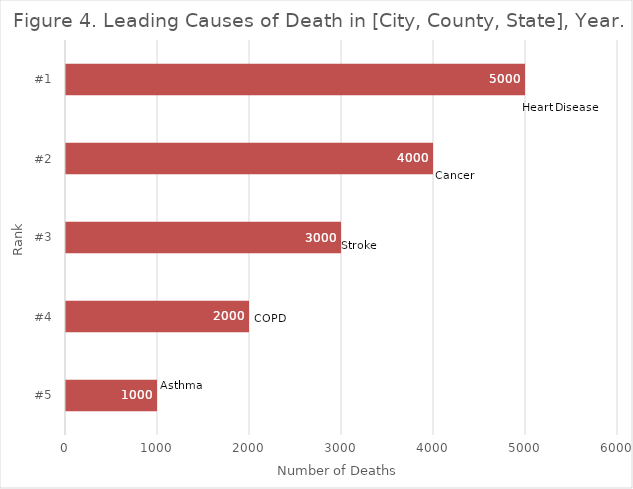
| Category | Series 1 |
|---|---|
| #5 | 1000 |
| #4 | 2000 |
| #3 | 3000 |
| #2 | 4000 |
| #1 | 5000 |